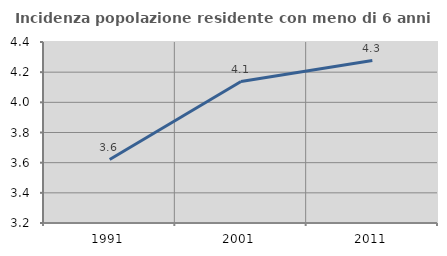
| Category | Incidenza popolazione residente con meno di 6 anni |
|---|---|
| 1991.0 | 3.621 |
| 2001.0 | 4.138 |
| 2011.0 | 4.277 |